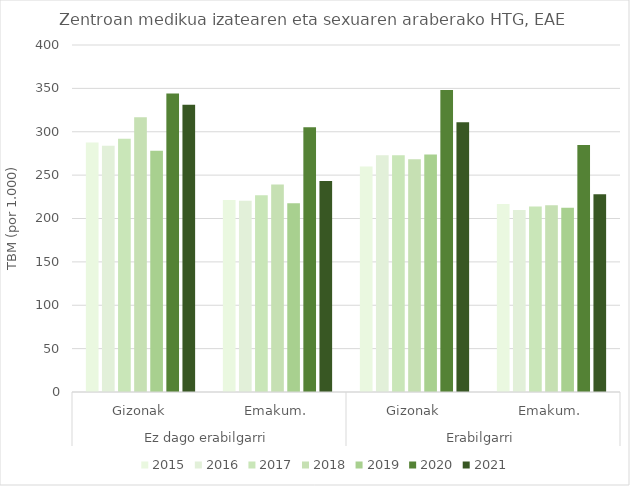
| Category | 2015 | 2016 | 2017 | 2018 | 2019 | 2020 | 2021 |
|---|---|---|---|---|---|---|---|
| 0 | 287.533 | 283.963 | 291.871 | 316.595 | 277.992 | 344.029 | 331.005 |
| 1 | 221.305 | 220.494 | 226.924 | 239.283 | 217.697 | 305.31 | 243.19 |
| 2 | 260.055 | 272.779 | 272.942 | 268.389 | 273.754 | 348.227 | 310.845 |
| 3 | 216.681 | 209.848 | 213.897 | 215.341 | 212.407 | 284.75 | 227.966 |